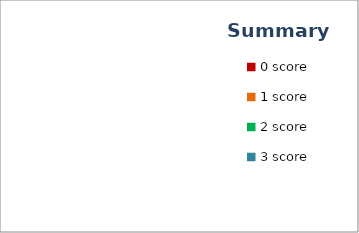
| Category | Series 0 |
|---|---|
| 0 score | 0 |
| 1 score | 0 |
| 2 score | 0 |
| 3 score | 0 |